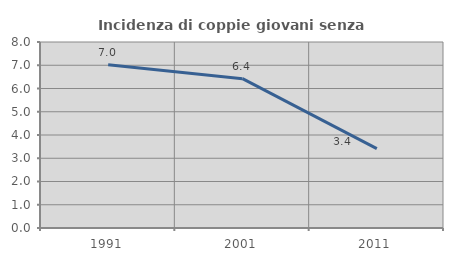
| Category | Incidenza di coppie giovani senza figli |
|---|---|
| 1991.0 | 7.022 |
| 2001.0 | 6.424 |
| 2011.0 | 3.414 |